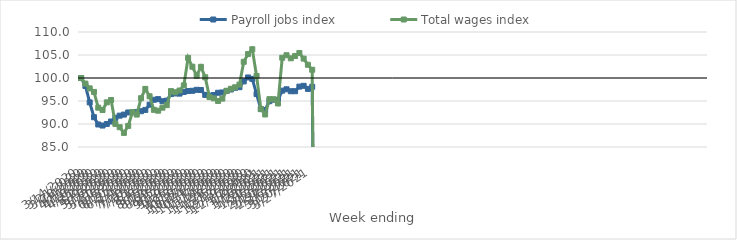
| Category | Payroll jobs index | Total wages index |
|---|---|---|
| 14/03/2020 | 100 | 100 |
| 21/03/2020 | 98.275 | 98.782 |
| 28/03/2020 | 94.696 | 97.738 |
| 04/04/2020 | 91.477 | 96.972 |
| 11/04/2020 | 89.893 | 93.55 |
| 18/04/2020 | 89.665 | 93.045 |
| 25/04/2020 | 90.012 | 94.709 |
| 02/05/2020 | 90.542 | 95.224 |
| 09/05/2020 | 91.346 | 90.024 |
| 16/05/2020 | 91.814 | 89.302 |
| 23/05/2020 | 92.044 | 88.067 |
| 30/05/2020 | 92.508 | 89.582 |
| 06/06/2020 | 92.554 | 92.578 |
| 13/06/2020 | 92.62 | 92.049 |
| 20/06/2020 | 92.778 | 95.606 |
| 27/06/2020 | 93.058 | 97.626 |
| 04/07/2020 | 94.203 | 96.021 |
| 11/07/2020 | 95.269 | 93.084 |
| 18/07/2020 | 95.404 | 92.894 |
| 25/07/2020 | 94.949 | 93.548 |
| 01/08/2020 | 95.079 | 94.096 |
| 08/08/2020 | 96.516 | 97.154 |
| 15/08/2020 | 96.645 | 96.9 |
| 22/08/2020 | 96.606 | 97.28 |
| 29/08/2020 | 96.97 | 98.395 |
| 05/09/2020 | 97.17 | 104.375 |
| 12/09/2020 | 97.219 | 102.45 |
| 19/09/2020 | 97.431 | 100.476 |
| 26/09/2020 | 97.386 | 102.428 |
| 03/10/2020 | 96.328 | 100.156 |
| 10/10/2020 | 96.151 | 95.843 |
| 17/10/2020 | 96.306 | 95.579 |
| 24/10/2020 | 96.79 | 95.016 |
| 31/10/2020 | 96.857 | 95.517 |
| 07/11/2020 | 97.181 | 97.211 |
| 14/11/2020 | 97.496 | 97.658 |
| 21/11/2020 | 97.87 | 97.975 |
| 28/11/2020 | 98.005 | 98.563 |
| 05/12/2020 | 99.26 | 103.517 |
| 12/12/2020 | 100.118 | 105.192 |
| 19/12/2020 | 99.815 | 106.249 |
| 26/12/2020 | 96.506 | 100.435 |
| 02/01/2021 | 93.227 | 93.273 |
| 09/01/2021 | 93.044 | 92.073 |
| 16/01/2021 | 94.964 | 95.394 |
| 23/01/2021 | 95.282 | 95.366 |
| 30/01/2021 | 95.22 | 94.464 |
| 06/02/2021 | 97.249 | 104.408 |
| 13/02/2021 | 97.548 | 104.952 |
| 20/02/2021 | 97.125 | 104.281 |
| 27/02/2021 | 97.125 | 104.776 |
| 06/03/2021 | 98.126 | 105.427 |
| 13/03/2021 | 98.299 | 104.213 |
| 20/03/2021 | 97.634 | 102.876 |
| 27/03/2021 | 98.086 | 101.791 |